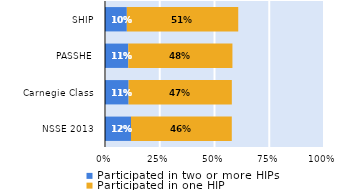
| Category | Participated in two or more HIPs | Participated in one HIP |
|---|---|---|
| NSSE 2013 | 0.119 | 0.46 |
| Carnegie Class | 0.108 | 0.471 |
| PASSHE | 0.106 | 0.476 |
| SHIP | 0.1 | 0.509 |